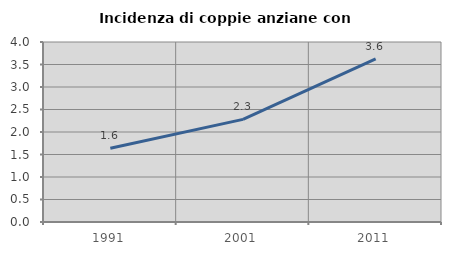
| Category | Incidenza di coppie anziane con figli |
|---|---|
| 1991.0 | 1.641 |
| 2001.0 | 2.28 |
| 2011.0 | 3.627 |